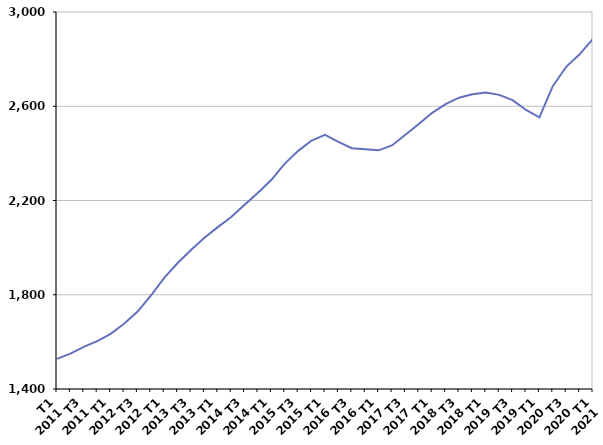
| Category | Inscrits depuis plus d'un an |
|---|---|
| T1
2011 | 1528 |
| T2
2011 | 1550.1 |
| T3
2011 | 1578.6 |
| T4
2011 | 1603.1 |
| T1
2012 | 1634 |
| T2
2012 | 1677.1 |
| T3
2012 | 1727.4 |
| T4
2012 | 1795.8 |
| T1
2013 | 1871.7 |
| T2
2013 | 1934.7 |
| T3
2013 | 1989.7 |
| T4
2013 | 2041.9 |
| T1
2014 | 2087 |
| T2
2014 | 2129.9 |
| T3
2014 | 2181.8 |
| T4
2014 | 2233.3 |
| T1
2015 | 2287.7 |
| T2
2015 | 2356.6 |
| T3
2015 | 2410.6 |
| T4
2015 | 2454.6 |
| T1
2016 | 2478.9 |
| T2
2016 | 2448.8 |
| T3
2016 | 2422.1 |
| T4
2016 | 2417.6 |
| T1
2017 | 2412.9 |
| T2
2017 | 2433.5 |
| T3
2017 | 2479.3 |
| T4
2017 | 2524.4 |
| T1
2018 | 2572.2 |
| T2
2018 | 2609.3 |
| T3
2018 | 2636.4 |
| T4
2018 | 2651.2 |
| T1
2019 | 2658.4 |
| T2
2019 | 2648.3 |
| T3
2019 | 2626.2 |
| T4
2019 | 2584.1 |
| T1
2020 | 2553.1 |
| T2
2020 | 2685.1 |
| T3
2020 | 2767.4 |
| T4
2020 | 2820.5 |
| T1
2021 | 2886.3 |